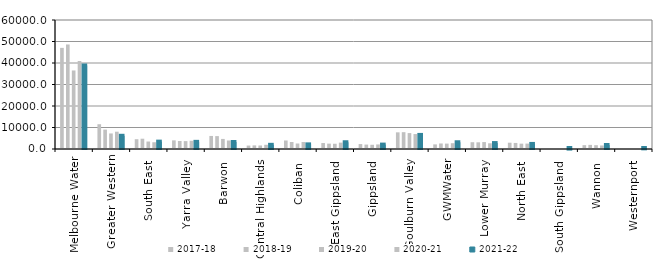
| Category | 2017-18 | 2018-19 | 2019-20 | 2020-21 | 2021-22 |
|---|---|---|---|---|---|
| Melbourne Water | 47038 | 48624 | 36529.7 | 40930 | 38837 |
| Greater Western | 11526.41 | 9025 | 7233.46 | 8048.947 | 6146.236 |
| South East  | 4562.51 | 4785.75 | 3472.8 | 3140.2 | 3424.7 |
| Yarra Valley  | 4018.7 | 3720.784 | 3666.041 | 3838.411 | 3323.599 |
| Barwon  | 6070 | 5997.717 | 4683.041 | 3951.486 | 3265.994 |
| Central Highlands  | 1593.054 | 1680.245 | 1625.6 | 1958.508 | 1945.561 |
| Coliban  | 3960 | 3261.4 | 2564 | 3229 | 2148.9 |
| East Gippsland  | 2773 | 2496.222 | 2437.581 | 2968.827 | 3139.31 |
| Gippsland  | 2291.096 | 2054.436 | 1968.857 | 2127.813 | 2049.4 |
| Goulburn Valley  | 7753.7 | 7821.29 | 7401.44 | 6953.45 | 6546.75 |
| GWMWater | 2147.24 | 2568.62 | 2509.354 | 2697.672 | 3132.542 |
| Lower Murray  | 3159 | 3110.337 | 3227.753 | 2659.002 | 2759.394 |
| North East  | 2925.9 | 2810.58 | 2487.775 | 2515.63 | 2355.78 |
| South Gippsland  | 123.3 | 124 | 121.959 | 193.63 | 189.454 |
| Wannon  | 1788.1 | 1915.361 | 1773.1 | 1634.916 | 1867.833 |
| Westernport  | 328.852 | 340.435 | 220.992 | 125.45 | 303.183 |